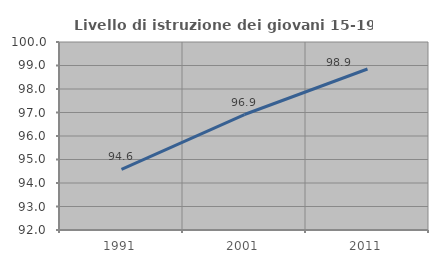
| Category | Livello di istruzione dei giovani 15-19 anni |
|---|---|
| 1991.0 | 94.578 |
| 2001.0 | 96.914 |
| 2011.0 | 98.851 |